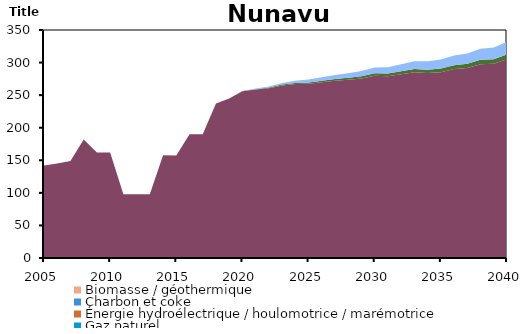
| Category | Biomasse / géothermique | Charbon et coke | Énergie hydroélectrique / houlomotrice / marémotrice | Gaz naturel | Pétrole | Solaire | Uranium | Éolien |
|---|---|---|---|---|---|---|---|---|
| 2005.0 | 0 | 0 | 0 | 0 | 142 | 0 | 0 | 0 |
| 2006.0 | 0 | 0 | 0 | 0 | 145 | 0 | 0 | 0 |
| 2007.0 | 0 | 0 | 0 | 0 | 149 | 0 | 0 | 0 |
| 2008.0 | 0 | 0 | 0 | 0 | 182 | 0 | 0 | 0 |
| 2009.0 | 0 | 0 | 0 | 0 | 162 | 0 | 0 | 0 |
| 2010.0 | 0 | 0 | 0 | 0 | 162 | 0 | 0 | 0 |
| 2011.0 | 0 | 0 | 0 | 0 | 98 | 0 | 0 | 0 |
| 2012.0 | 0 | 0 | 0 | 0 | 98 | 0 | 0 | 0 |
| 2013.0 | 0 | 0 | 0 | 0 | 98 | 0 | 0 | 0 |
| 2014.0 | 0 | 0 | 0 | 0 | 157.598 | 0 | 0 | 0 |
| 2015.0 | 0 | 0 | 0 | 0 | 157.415 | 0 | 0 | 0 |
| 2016.0 | 0 | 0 | 0 | 0 | 189.829 | 0 | 0 | 0 |
| 2017.0 | 0 | 0 | 0 | 0 | 189.829 | 0 | 0 | 0 |
| 2018.0 | 0 | 0 | 0 | 0 | 237.248 | 0 | 0 | 0 |
| 2019.0 | 0 | 0 | 0 | 0 | 244.741 | 0 | 0 | 0 |
| 2020.0 | 0 | 0 | 0 | 0 | 255.859 | 0.35 | 0 | 0 |
| 2021.0 | 0 | 0 | 0 | 0 | 258.58 | 0.643 | 0 | 0.846 |
| 2022.0 | 0 | 0 | 0 | 0 | 260.719 | 0.956 | 0 | 1.672 |
| 2023.0 | 0 | 0 | 0 | 0 | 264.931 | 1.292 | 0 | 2.562 |
| 2024.0 | 0 | 0 | 0 | 0 | 267.011 | 1.634 | 0 | 3.462 |
| 2025.0 | 0 | 0 | 0 | 0 | 267.531 | 1.974 | 0 | 4.357 |
| 2026.0 | 0 | 0 | 0 | 0 | 269.952 | 2.321 | 0 | 5.272 |
| 2027.0 | 0 | 0 | 0 | 0 | 272.148 | 2.666 | 0 | 6.184 |
| 2028.0 | 0 | 0 | 0 | 0 | 273.535 | 3.019 | 0 | 7.116 |
| 2029.0 | 0 | 0 | 0 | 0 | 275.73 | 3.369 | 0 | 8.04 |
| 2030.0 | 0 | 0 | 0 | 0 | 279.716 | 3.729 | 0 | 8.986 |
| 2031.0 | 0 | 0 | 0 | 0 | 278.967 | 4.091 | 0 | 9.942 |
| 2032.0 | 0 | 0 | 0 | 0 | 282.137 | 4.462 | 0 | 10.921 |
| 2033.0 | 0 | 0 | 0 | 0 | 285.296 | 4.832 | 0 | 11.895 |
| 2034.0 | 0 | 0 | 0 | 0 | 283.836 | 5.21 | 0 | 12.89 |
| 2035.0 | 0 | 0 | 0 | 0 | 285.226 | 5.587 | 0 | 13.881 |
| 2036.0 | 0 | 0 | 0 | 0 | 290.049 | 5.967 | 0 | 14.899 |
| 2037.0 | 0 | 0 | 0 | 0 | 291.803 | 6.353 | 0 | 15.912 |
| 2038.0 | 0 | 0 | 0 | 0 | 297.483 | 6.745 | 0 | 16.938 |
| 2039.0 | 0 | 0 | 0 | 0 | 298.036 | 7.147 | 0 | 17.995 |
| 2040.0 | 0 | 0 | 0 | 0 | 305.189 | 7.555 | 0 | 19.063 |